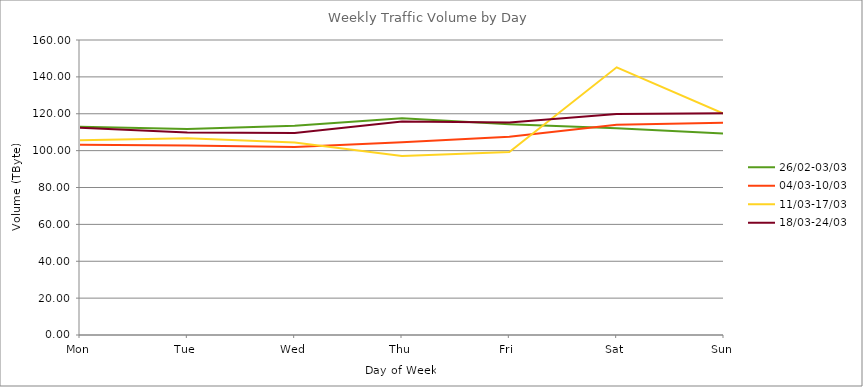
| Category | 26/02-03/03 | 04/03-10/03 | 11/03-17/03 | 18/03-24/03 |
|---|---|---|---|---|
| Mon | 112.91 | 103.25 | 105.64 | 112.35 |
| Tue | 111.76 | 102.8 | 106.66 | 109.89 |
| Wed | 113.53 | 101.93 | 104.36 | 109.56 |
| Thu | 117.55 | 104.55 | 97.07 | 115.81 |
| Fri | 114.37 | 107.54 | 99.29 | 115.24 |
| Sat | 112.18 | 114.06 | 145.19 | 119.85 |
| Sun | 109.29 | 115.14 | 119.95 | 120.28 |